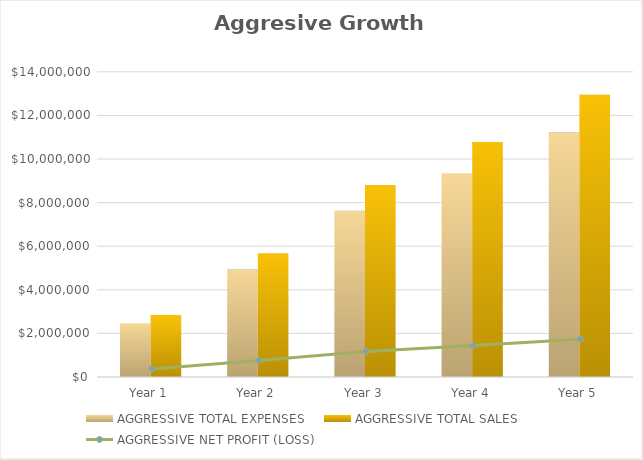
| Category | AGGRESSIVE TOTAL EXPENSES | AGGRESSIVE TOTAL SALES |
|---|---|---|
| 0 | 2467813.21 | 2840000 |
| 1 | 4925626.42 | 5680000 |
| 2 | 7629220.95 | 8804000 |
| 3 | 9343545.664 | 10784900 |
| 4 | 11210254.797 | 12941880 |